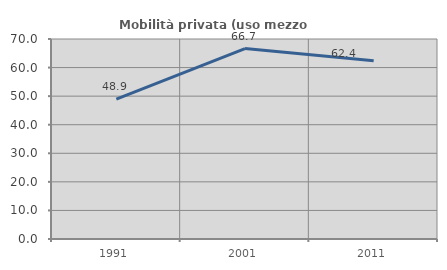
| Category | Mobilità privata (uso mezzo privato) |
|---|---|
| 1991.0 | 48.942 |
| 2001.0 | 66.667 |
| 2011.0 | 62.357 |